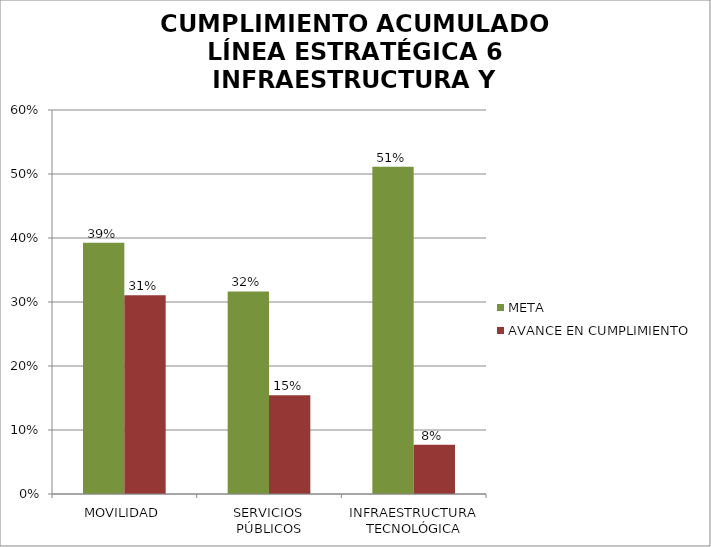
| Category | META | AVANCE EN CUMPLIMIENTO |
|---|---|---|
| MOVILIDAD | 0.392 | 0.31 |
| SERVICIOS PÚBLICOS | 0.316 | 0.154 |
| INFRAESTRUCTURA TECNOLÓGICA | 0.511 | 0.077 |